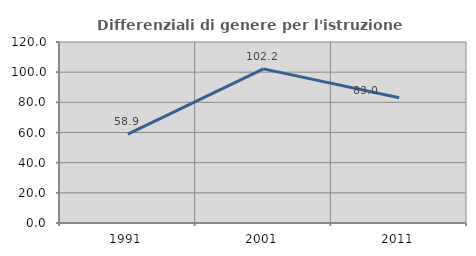
| Category | Differenziali di genere per l'istruzione superiore |
|---|---|
| 1991.0 | 58.897 |
| 2001.0 | 102.19 |
| 2011.0 | 83.018 |